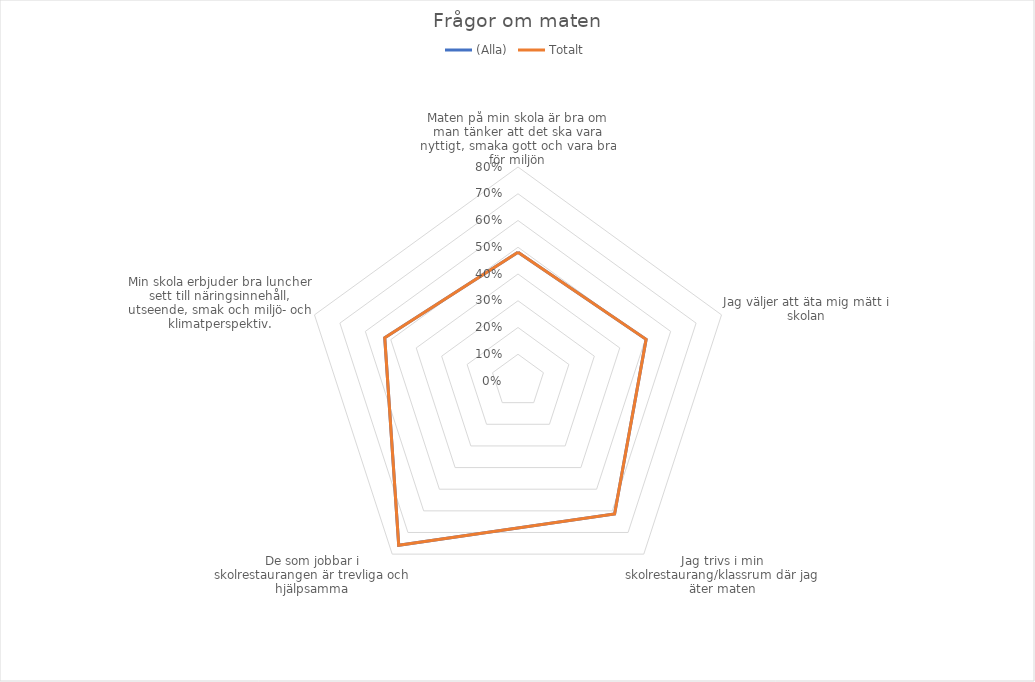
| Category | (Alla) | Totalt |
|---|---|---|
| Maten på min skola är bra om man tänker att det ska vara nyttigt, smaka gott och vara bra för miljön | 0.481 | 0.481 |
| Jag väljer att äta mig mätt i skolan | 0.504 | 0.504 |
| Jag trivs i min skolrestaurang/klassrum där jag äter maten | 0.614 | 0.614 |
| De som jobbar i skolrestaurangen är trevliga och hjälpsamma | 0.759 | 0.759 |
| Min skola erbjuder bra luncher sett till näringsinnehåll, utseende, smak och miljö- och klimatperspektiv. | 0.524 | 0.524 |